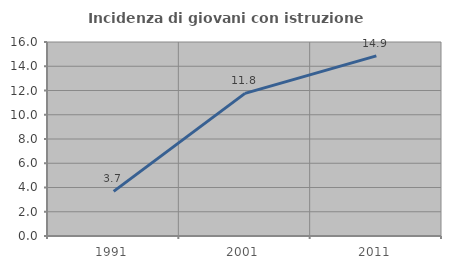
| Category | Incidenza di giovani con istruzione universitaria |
|---|---|
| 1991.0 | 3.681 |
| 2001.0 | 11.765 |
| 2011.0 | 14.851 |